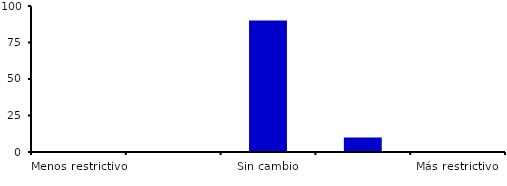
| Category | Series 0 |
|---|---|
| Menos restrictivo | 0 |
| Moderadamente menos restrictivo | 0 |
| Sin cambio | 90 |
| Moderadamente más restrictivo | 10 |
| Más restrictivo | 0 |